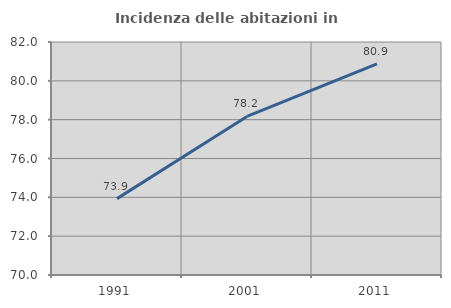
| Category | Incidenza delle abitazioni in proprietà  |
|---|---|
| 1991.0 | 73.934 |
| 2001.0 | 78.165 |
| 2011.0 | 80.872 |